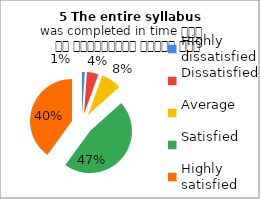
| Category | 5 The entire syllabus
was completed in time समय पर पाठ्यक्रम पूर्ण हुआ |
|---|---|
| Highly dissatisfied | 1 |
| Dissatisfied | 4 |
| Average | 7 |
| Satisfied | 42 |
| Highly satisfied | 36 |